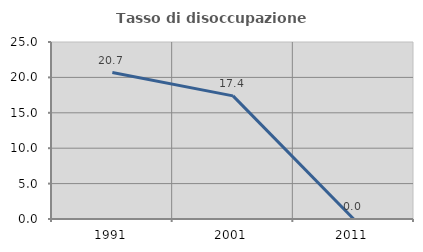
| Category | Tasso di disoccupazione giovanile  |
|---|---|
| 1991.0 | 20.69 |
| 2001.0 | 17.391 |
| 2011.0 | 0 |